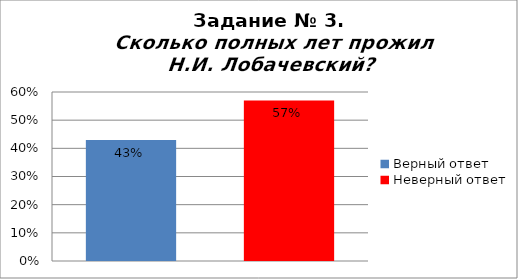
| Category | Сколько полных лет прожил Н.И. Лобачевский? |
|---|---|
| Верный ответ | 0.43 |
| Неверный ответ | 0.57 |